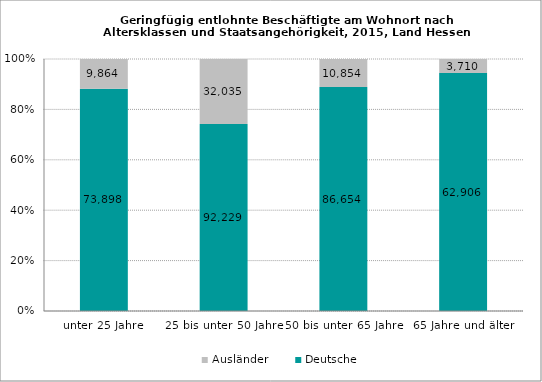
| Category | Deutsche | Ausländer |
|---|---|---|
| unter 25 Jahre | 73898 | 9864 |
| 25 bis unter 50 Jahre | 92229 | 32035 |
| 50 bis unter 65 Jahre | 86654 | 10854 |
| 65 Jahre und älter | 62906 | 3710 |